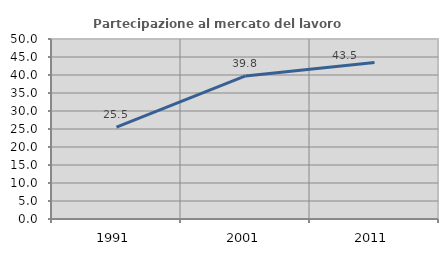
| Category | Partecipazione al mercato del lavoro  femminile |
|---|---|
| 1991.0 | 25.532 |
| 2001.0 | 39.754 |
| 2011.0 | 43.462 |